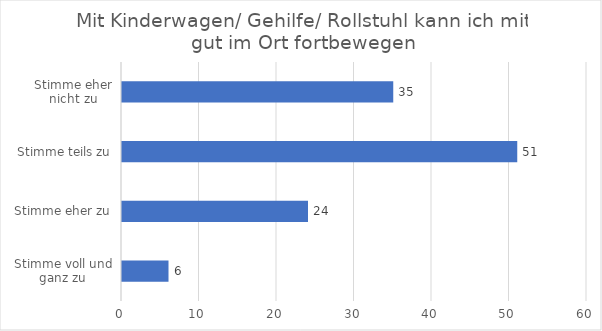
| Category | Series 0 |
|---|---|
| Stimme voll und ganz zu | 6 |
| Stimme eher zu | 24 |
| Stimme teils zu | 51 |
| Stimme eher nicht zu | 35 |